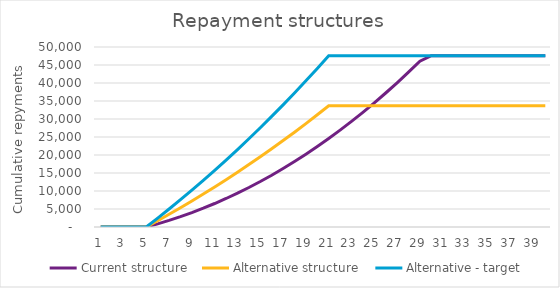
| Category | Current structure | Alternative structure | Alternative - target |
|---|---|---|---|
| 1.0 | 0 | 0 | 0 |
| 2.0 | 0 | 0 | 0 |
| 3.0 | 0 | 0 | 0 |
| 4.0 | 0 | 0 | 0 |
| 5.0 | 0 | 0 | 0 |
| 6.0 | 873.009 | 1746.018 | 2467.892 |
| 7.0 | 1831.19 | 3534.622 | 4995.977 |
| 8.0 | 2875.061 | 5366.85 | 7585.723 |
| 9.0 | 4005.194 | 7243.767 | 10238.633 |
| 10.0 | 5222.208 | 9166.463 | 12956.248 |
| 11.0 | 6526.777 | 11136.053 | 15740.147 |
| 12.0 | 7919.624 | 13153.682 | 18591.945 |
| 13.0 | 9401.525 | 15220.522 | 21513.3 |
| 14.0 | 10973.309 | 17337.772 | 24505.907 |
| 15.0 | 12635.858 | 19506.662 | 27571.504 |
| 16.0 | 14390.106 | 21728.453 | 30711.872 |
| 17.0 | 16237.043 | 24004.433 | 33928.835 |
| 18.0 | 18177.711 | 26335.925 | 37224.26 |
| 19.0 | 20213.21 | 28724.283 | 40600.061 |
| 20.0 | 22344.695 | 31170.893 | 44058.199 |
| 21.0 | 24573.376 | 33677.177 | 47600.682 |
| 22.0 | 26900.521 | 33677.177 | 47600.682 |
| 23.0 | 29327.455 | 33677.177 | 47600.682 |
| 24.0 | 31855.564 | 33677.177 | 47600.682 |
| 25.0 | 34486.291 | 33677.177 | 47600.682 |
| 26.0 | 37221.14 | 33677.177 | 47600.682 |
| 27.0 | 40061.676 | 33677.177 | 47600.682 |
| 28.0 | 43009.526 | 33677.177 | 47600.682 |
| 29.0 | 46066.38 | 33677.177 | 47600.682 |
| 30.0 | 47600.682 | 33677.177 | 47600.682 |
| 31.0 | 47600.682 | 33677.177 | 47600.682 |
| 32.0 | 47600.682 | 33677.177 | 47600.682 |
| 33.0 | 47600.682 | 33677.177 | 47600.682 |
| 34.0 | 47600.682 | 33677.177 | 47600.682 |
| 35.0 | 47600.682 | 33677.177 | 47600.682 |
| 36.0 | 47600.682 | 33677.177 | 47600.682 |
| 37.0 | 47600.682 | 33677.177 | 47600.682 |
| 38.0 | 47600.682 | 33677.177 | 47600.682 |
| 39.0 | 47600.682 | 33677.177 | 47600.682 |
| 40.0 | 47600.682 | 33677.177 | 47600.682 |